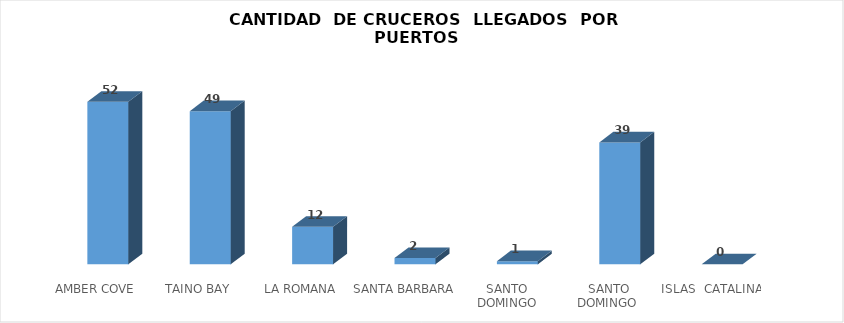
| Category | Series 0 |
|---|---|
| AMBER COVE | 52 |
| TAINO BAY | 49 |
| LA ROMANA | 12 |
| SANTA BARBARA  | 2 |
| SANTO DOMINGO | 1 |
| SANTO DOMINGO  FERRY | 39 |
| ISLAS  CATALINA  | 0 |